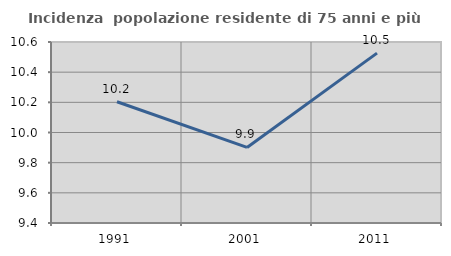
| Category | Incidenza  popolazione residente di 75 anni e più |
|---|---|
| 1991.0 | 10.204 |
| 2001.0 | 9.901 |
| 2011.0 | 10.526 |